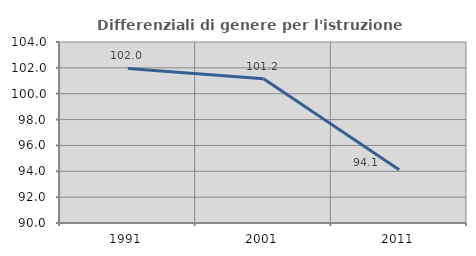
| Category | Differenziali di genere per l'istruzione superiore |
|---|---|
| 1991.0 | 101.955 |
| 2001.0 | 101.151 |
| 2011.0 | 94.117 |